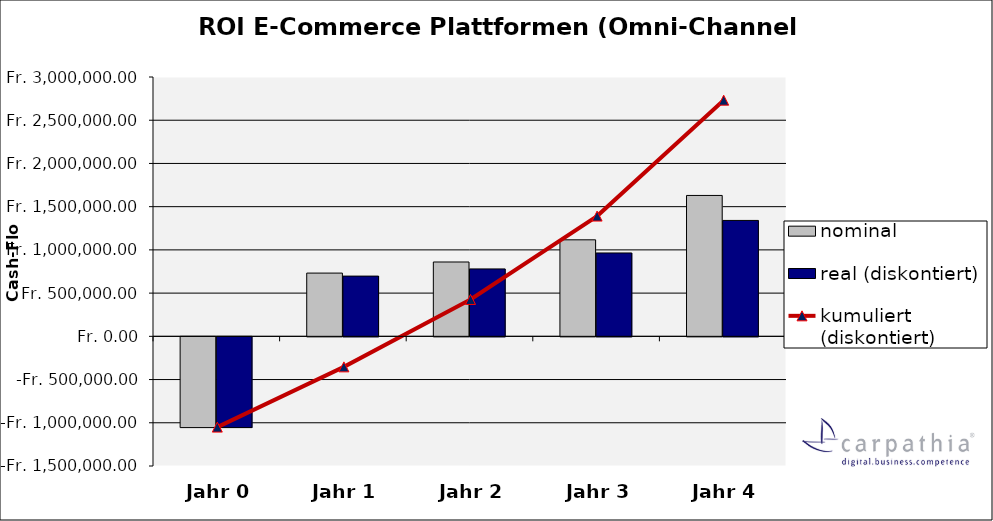
| Category | nominal | real (diskontiert) |
|---|---|---|
| Jahr 0 | -1050000 | -1050000 |
| Jahr 1 | 731608 | 696769.524 |
| Jahr 2 | 859912 | 779965.533 |
| Jahr 3 | 1116520 | 964491.956 |
| Jahr 4 | 1629736 | 1340787.84 |